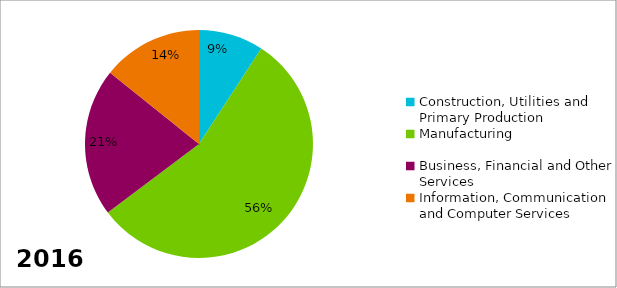
| Category | Series 0 |
|---|---|
| Construction, Utilities and Primary Production | 0.092 |
| Manufacturing | 0.556 |
| Business, Financial and Other Services | 0.21 |
| Information, Communication and Computer Services | 0.142 |